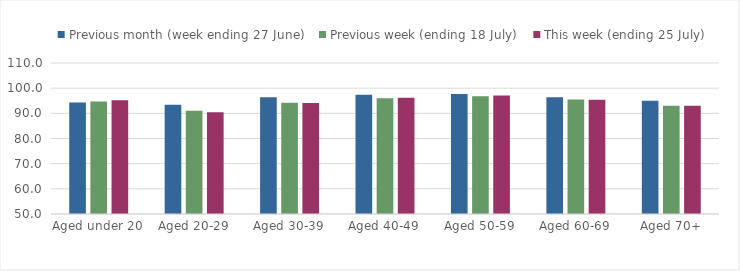
| Category | Previous month (week ending 27 June) | Previous week (ending 18 July) | This week (ending 25 July) |
|---|---|---|---|
| Aged under 20 | 94.339 | 94.696 | 95.206 |
| Aged 20-29 | 93.445 | 90.998 | 90.448 |
| Aged 30-39 | 96.412 | 94.233 | 94.065 |
| Aged 40-49 | 97.416 | 95.983 | 96.161 |
| Aged 50-59 | 97.686 | 96.806 | 97.125 |
| Aged 60-69 | 96.392 | 95.461 | 95.405 |
| Aged 70+ | 94.962 | 92.994 | 93.046 |